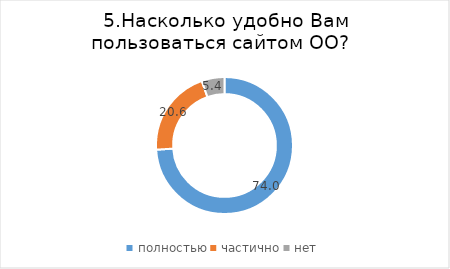
| Category | Series 0 |
|---|---|
| полностью | 74.031 |
| частично | 20.583 |
| нет | 5.386 |